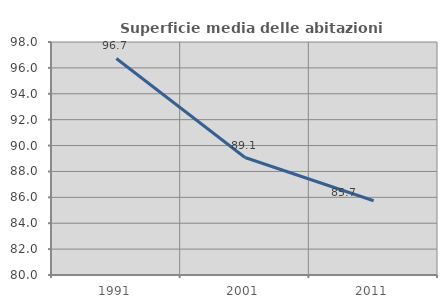
| Category | Superficie media delle abitazioni occupate |
|---|---|
| 1991.0 | 96.729 |
| 2001.0 | 89.076 |
| 2011.0 | 85.737 |